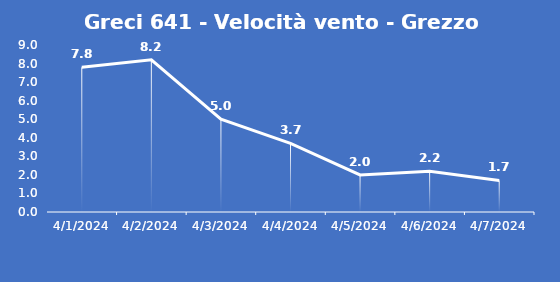
| Category | Greci 641 - Velocità vento - Grezzo (m/s) |
|---|---|
| 4/1/24 | 7.8 |
| 4/2/24 | 8.2 |
| 4/3/24 | 5 |
| 4/4/24 | 3.7 |
| 4/5/24 | 2 |
| 4/6/24 | 2.2 |
| 4/7/24 | 1.7 |